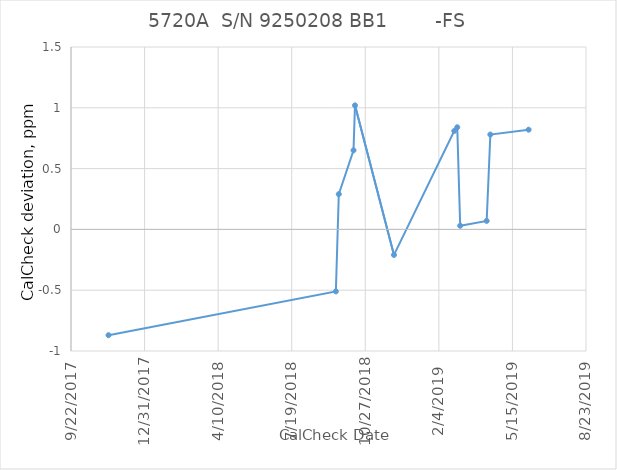
| Category |        -FS |
|---|---|
| 43051.0 | -0.87 |
| 43360.0 | -0.51 |
| 43364.0 | 0.29 |
| 43384.0 | 0.65 |
| 43386.0 | 1.02 |
| 43439.0 | -0.21 |
| 43521.0 | 0.81 |
| 43525.0 | 0.84 |
| 43529.0 | 0.03 |
| 43565.0 | 0.07 |
| 43570.0 | 0.78 |
| 43622.0 | 0.82 |